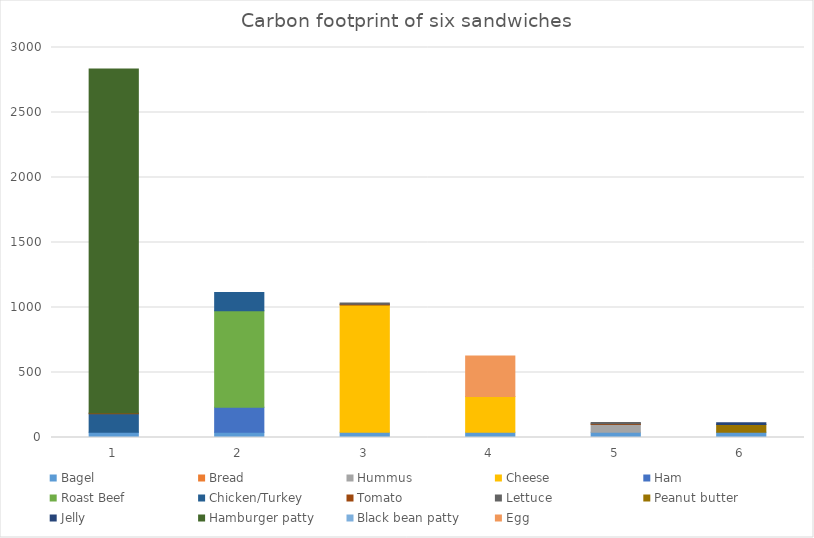
| Category | Bagel  | Bread | Hummus  | Cheese  | Ham  | Roast Beef  | Chicken/Turkey  | Tomato | Lettuce  | Peanut butter | Jelly  | Hamburger patty | Black bean patty | Egg |
|---|---|---|---|---|---|---|---|---|---|---|---|---|---|---|
| 1.0 | 41.16 | 0 | 0 | 0 | 0 | 0 | 141.68 | 6 | 0 | 0 | 0 | 2645 | 0 | 0 |
| 2.0 | 41.16 | 0 | 0 | 0 | 192.36 | 740.6 | 141.68 | 0 | 0 | 0 | 0 | 0 | 0 | 0 |
| 3.0 | 41.16 | 0 | 0 | 978 | 0 | 0 | 0 | 6 | 10.3 | 0 | 0 | 0 | 0 | 0 |
| 4.0 | 41.16 | 0 | 0 | 273.84 | 0 | 0 | 0 | 0 | 0 | 0 | 0 | 0 | 0 | 311.52 |
| 5.0 | 41.16 | 0 | 58.5 | 0 | 0 | 0 | 0 | 6 | 10.3 | 0 | 0 | 0 | 0 | 0 |
| 6.0 | 41.16 | 0 | 0 | 0 | 0 | 0 | 0 | 0 | 0 | 58.2 | 14 | 0 | 0 | 0 |